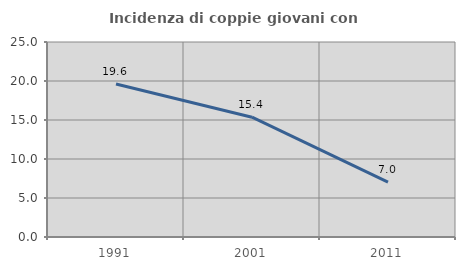
| Category | Incidenza di coppie giovani con figli |
|---|---|
| 1991.0 | 19.611 |
| 2001.0 | 15.36 |
| 2011.0 | 7.048 |